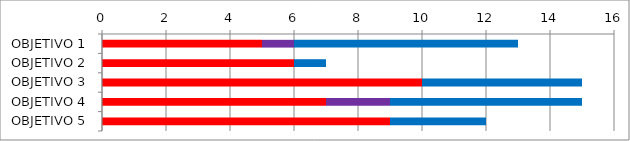
| Category | Series 0 | Series 3 | Series 1 |
|---|---|---|---|
| OBJETIVO 1 | 5 | 1 | 7 |
| OBJETIVO 2 | 6 | 0 | 1 |
| OBJETIVO 3 | 10 | 0 | 5 |
| OBJETIVO 4 | 7 | 2 | 6 |
| OBJETIVO 5 | 9 | 0 | 3 |